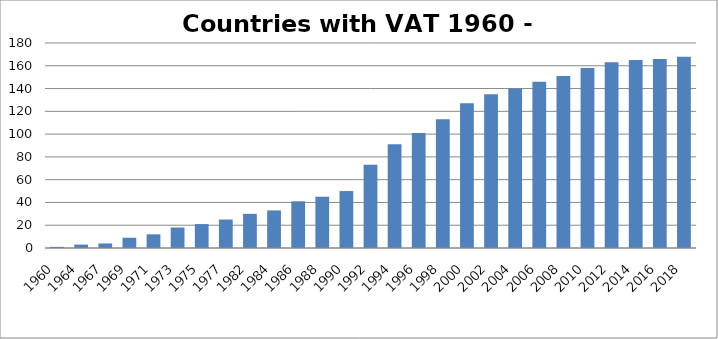
| Category | Series 0 |
|---|---|
| 1960.0 | 1 |
| 1964.0 | 3 |
| 1967.0 | 4 |
| 1969.0 | 9 |
| 1971.0 | 12 |
| 1973.0 | 18 |
| 1975.0 | 21 |
| 1977.0 | 25 |
| 1982.0 | 30 |
| 1984.0 | 33 |
| 1986.0 | 41 |
| 1988.0 | 45 |
| 1990.0 | 50 |
| 1992.0 | 73 |
| 1994.0 | 91 |
| 1996.0 | 101 |
| 1998.0 | 113 |
| 2000.0 | 127 |
| 2002.0 | 135 |
| 2004.0 | 140 |
| 2006.0 | 146 |
| 2008.0 | 151 |
| 2010.0 | 158 |
| 2012.0 | 163 |
| 2014.0 | 165 |
| 2016.0 | 166 |
| 2018.0 | 168 |